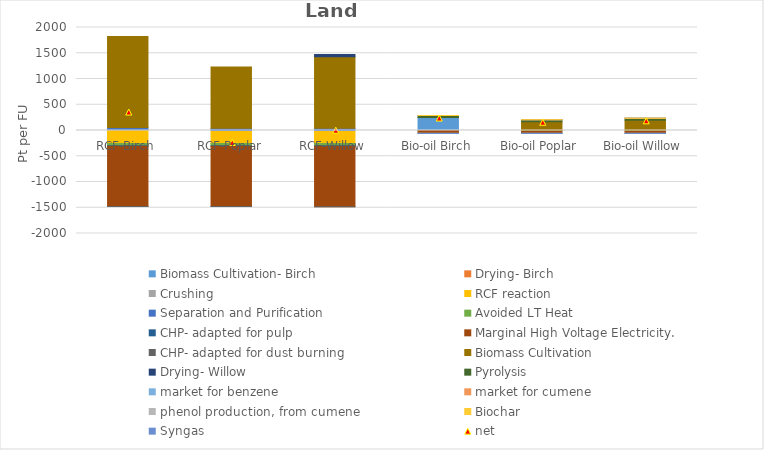
| Category | Biomass Cultivation- Birch | Drying- Birch | Crushing | RCF reaction | Separation and Purification | Avoided LT Heat  | CHP- adapted for pulp | Marginal High Voltage Electricity.  | CHP- adapted for dust burning | Biomass Cultivation | Drying- Willow | Pyrolysis | market for benzene | market for cumene | phenol production, from cumene | Biochar | Syngas |
|---|---|---|---|---|---|---|---|---|---|---|---|---|---|---|---|---|---|
| RCF-Birch | 0 | 16.165 | 0.033 | -253.846 | 42.052 | -41.249 | -9.336 | -1172.347 | -0.231 | 1766.953 | 0 | 0 | 0 | 0 | 0 | 0 | 0 |
| RCF-Poplar | 0 | 0 | 0.033 | -253.743 | 42.052 | -41.225 | -9.33 | -1171.364 | -0.225 | 1191.725 | 0 | 0 | 0 | 0 | 0 | 0 | 0 |
| RCF-Willow | 0 | 0 | 0.033 | -254.052 | 42.052 | -41.276 | -9.342 | -1174.143 | -0.256 | 1389.711 | 42.961 | 0 | 0 | 0 | 0 | 0 | 0 |
| Bio-oil Birch | 250.778 | 0 | 0.005 | 0 | 0 | -0.098 | 0 | -55.132 | -0.011 | 0 | 0 | 38.55 | 0.126 | 0.086 | -2.732 | 0.531 | -0.19 |
| Bio-oil Poplar | 0 | 0 | 0.005 | 0 | 0 | -0.098 | 0 | -55.11 | -0.011 | 169.269 | 0 | 38.55 | 0.126 | 0.086 | -2.732 | 0.531 | -0.19 |
| Bio-oil Willow | 0 | 0 | 0.005 | 0 | 0 | -0.098 | 0 | -55.205 | -0.013 | 196.986 | 0 | 38.55 | 0.126 | 0.086 | -2.732 | 0.531 | -0.19 |